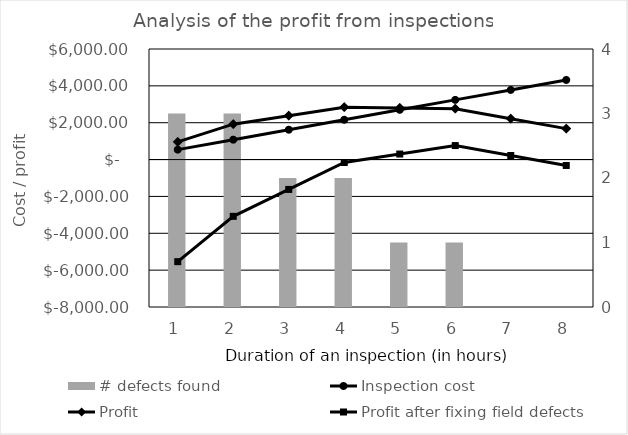
| Category | # defects found |
|---|---|
| 0 | 3 |
| 1 | 3 |
| 2 | 2 |
| 3 | 2 |
| 4 | 1 |
| 5 | 1 |
| 6 | 0 |
| 7 | 0 |